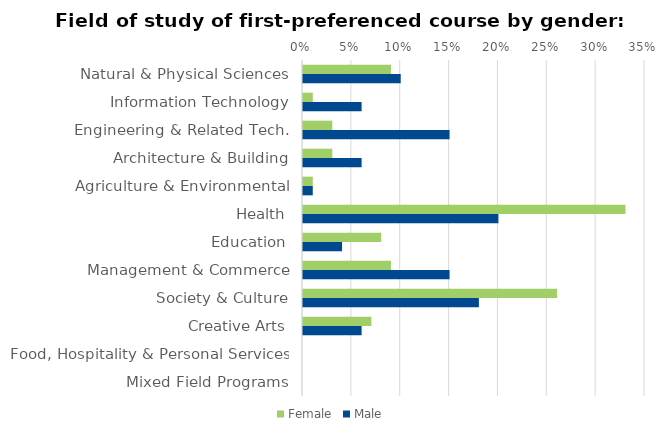
| Category | Female | Male |
|---|---|---|
| Natural & Physical Sciences | 0.09 | 0.1 |
| Information Technology | 0.01 | 0.06 |
| Engineering & Related Tech. | 0.03 | 0.15 |
| Architecture & Building | 0.03 | 0.06 |
| Agriculture & Environmental | 0.01 | 0.01 |
| Health | 0.33 | 0.2 |
| Education | 0.08 | 0.04 |
| Management & Commerce | 0.09 | 0.15 |
| Society & Culture | 0.26 | 0.18 |
| Creative Arts | 0.07 | 0.06 |
| Food, Hospitality & Personal Services | 0 | 0 |
| Mixed Field Programs | 0 | 0 |